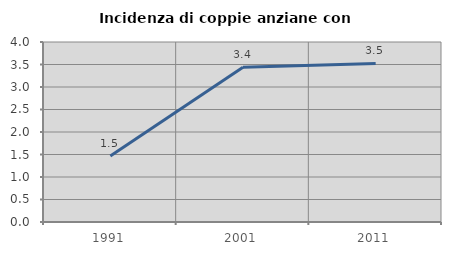
| Category | Incidenza di coppie anziane con figli |
|---|---|
| 1991.0 | 1.469 |
| 2001.0 | 3.441 |
| 2011.0 | 3.524 |